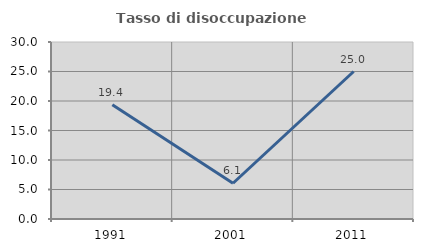
| Category | Tasso di disoccupazione giovanile  |
|---|---|
| 1991.0 | 19.355 |
| 2001.0 | 6.061 |
| 2011.0 | 25 |